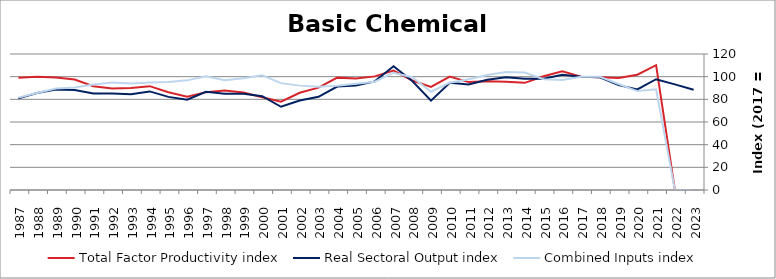
| Category | Total Factor Productivity index | Real Sectoral Output index | Combined Inputs index |
|---|---|---|---|
| 2023.0 | 0 | 88.501 | 0 |
| 2022.0 | 0 | 93.232 | 0 |
| 2021.0 | 110.098 | 97.762 | 88.796 |
| 2020.0 | 101.738 | 88.803 | 87.286 |
| 2019.0 | 98.903 | 92.512 | 93.538 |
| 2018.0 | 99.592 | 99.416 | 99.823 |
| 2017.0 | 100 | 100 | 100 |
| 2016.0 | 104.815 | 101.733 | 97.06 |
| 2015.0 | 100.378 | 98.168 | 97.798 |
| 2014.0 | 94.556 | 98.055 | 103.7 |
| 2013.0 | 95.572 | 99.436 | 104.043 |
| 2012.0 | 95.887 | 97.304 | 101.477 |
| 2011.0 | 95.204 | 93.023 | 97.709 |
| 2010.0 | 100.002 | 94.696 | 94.694 |
| 2009.0 | 90.942 | 78.848 | 86.701 |
| 2008.0 | 96.623 | 96.107 | 99.466 |
| 2007.0 | 105.456 | 109.163 | 103.516 |
| 2006.0 | 100.244 | 95.826 | 95.593 |
| 2005.0 | 98.364 | 92.209 | 93.743 |
| 2004.0 | 99.147 | 91.288 | 92.073 |
| 2003.0 | 90.319 | 82.187 | 90.997 |
| 2002.0 | 85.776 | 78.995 | 92.094 |
| 2001.0 | 77.887 | 73.433 | 94.282 |
| 2000.0 | 81.792 | 82.731 | 101.149 |
| 1999.0 | 85.964 | 84.829 | 98.679 |
| 1998.0 | 87.847 | 84.992 | 96.749 |
| 1997.0 | 86.343 | 86.598 | 100.296 |
| 1996.0 | 82.394 | 79.705 | 96.737 |
| 1995.0 | 86.221 | 82.172 | 95.305 |
| 1994.0 | 91.625 | 86.998 | 94.95 |
| 1993.0 | 90.102 | 84.584 | 93.876 |
| 1992.0 | 89.628 | 85.052 | 94.894 |
| 1991.0 | 91.609 | 85.247 | 93.055 |
| 1990.0 | 97.494 | 88.231 | 90.499 |
| 1989.0 | 99.207 | 88.754 | 89.463 |
| 1988.0 | 99.899 | 85.565 | 85.652 |
| 1987.0 | 99.152 | 80.841 | 81.532 |